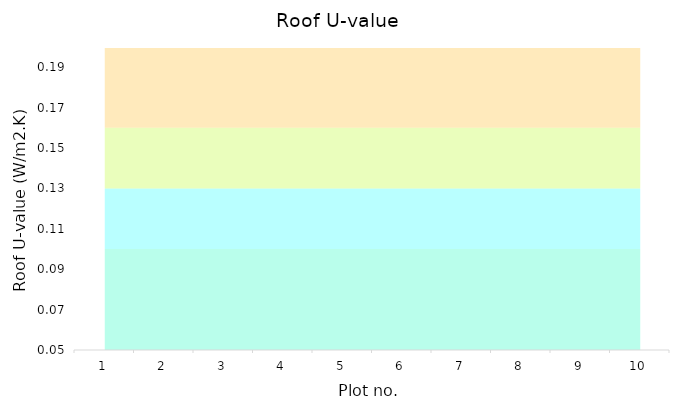
| Category | Series 0 | Series 1 | Series 2 | Series 3 |
|---|---|---|---|---|
| 0 | 0.1 | 0.03 | 0.03 | 0.04 |
| 1 | 0.1 | 0.03 | 0.03 | 0.04 |
| 2 | 0.1 | 0.03 | 0.03 | 0.04 |
| 3 | 0.1 | 0.03 | 0.03 | 0.04 |
| 4 | 0.1 | 0.03 | 0.03 | 0.04 |
| 5 | 0.1 | 0.03 | 0.03 | 0.04 |
| 6 | 0.1 | 0.03 | 0.03 | 0.04 |
| 7 | 0.1 | 0.03 | 0.03 | 0.04 |
| 8 | 0.1 | 0.03 | 0.03 | 0.04 |
| 9 | 0.1 | 0.03 | 0.03 | 0.04 |